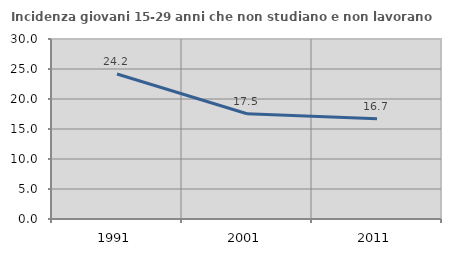
| Category | Incidenza giovani 15-29 anni che non studiano e non lavorano  |
|---|---|
| 1991.0 | 24.165 |
| 2001.0 | 17.544 |
| 2011.0 | 16.704 |